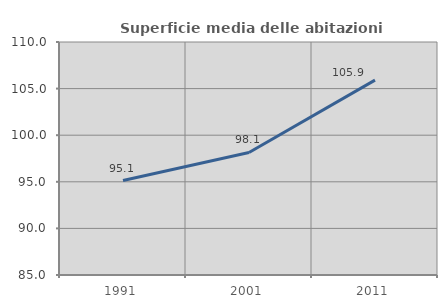
| Category | Superficie media delle abitazioni occupate |
|---|---|
| 1991.0 | 95.13 |
| 2001.0 | 98.146 |
| 2011.0 | 105.905 |